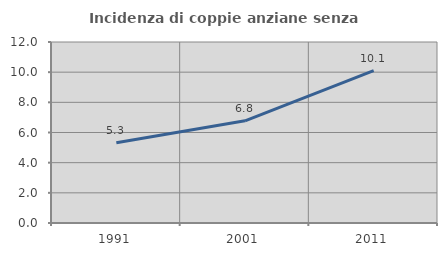
| Category | Incidenza di coppie anziane senza figli  |
|---|---|
| 1991.0 | 5.327 |
| 2001.0 | 6.777 |
| 2011.0 | 10.101 |